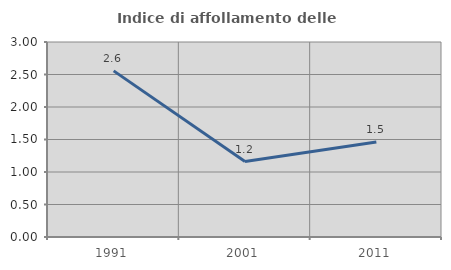
| Category | Indice di affollamento delle abitazioni  |
|---|---|
| 1991.0 | 2.556 |
| 2001.0 | 1.161 |
| 2011.0 | 1.461 |